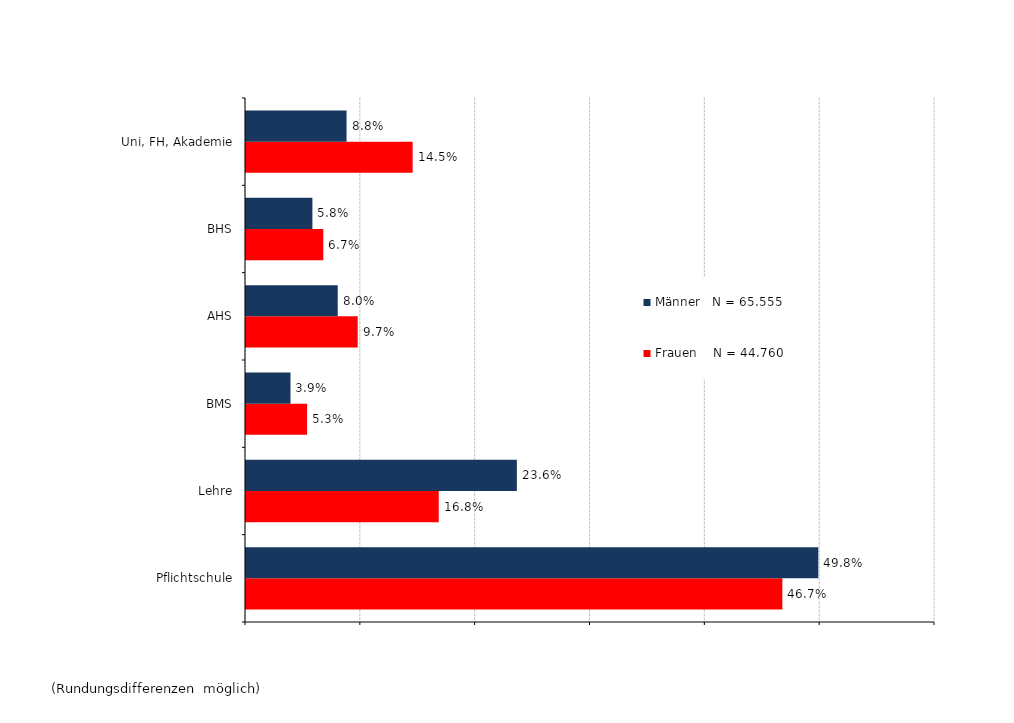
| Category | Frauen    N = 44.760 | Männer   N = 65.555 |
|---|---|---|
| Pflichtschule | 0.467 | 0.498 |
| Lehre | 0.168 | 0.236 |
| BMS | 0.053 | 0.039 |
| AHS | 0.097 | 0.08 |
| BHS | 0.067 | 0.058 |
| Uni, FH, Akademie | 0.145 | 0.088 |